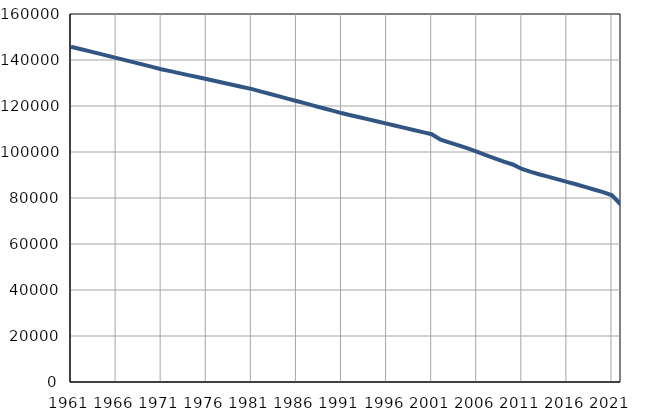
| Category | Population
size |
|---|---|
| 1961.0 | 145789 |
| 1962.0 | 144811 |
| 1963.0 | 143833 |
| 1964.0 | 142855 |
| 1965.0 | 141877 |
| 1966.0 | 140899 |
| 1967.0 | 139920 |
| 1968.0 | 138942 |
| 1969.0 | 137964 |
| 1970.0 | 136986 |
| 1971.0 | 136008 |
| 1972.0 | 135150 |
| 1973.0 | 134292 |
| 1974.0 | 133434 |
| 1975.0 | 132576 |
| 1976.0 | 131718 |
| 1977.0 | 130859 |
| 1978.0 | 130001 |
| 1979.0 | 129143 |
| 1980.0 | 128285 |
| 1981.0 | 127427 |
| 1982.0 | 126377 |
| 1983.0 | 125327 |
| 1984.0 | 124277 |
| 1985.0 | 123227 |
| 1986.0 | 122177 |
| 1987.0 | 121126 |
| 1988.0 | 120076 |
| 1989.0 | 119026 |
| 1990.0 | 117976 |
| 1991.0 | 116926 |
| 1992.0 | 116007 |
| 1993.0 | 115088 |
| 1994.0 | 114168 |
| 1995.0 | 113249 |
| 1996.0 | 112330 |
| 1997.0 | 111411 |
| 1998.0 | 110492 |
| 1999.0 | 109573 |
| 2000.0 | 108653 |
| 2001.0 | 107734 |
| 2002.0 | 105314 |
| 2003.0 | 104072 |
| 2004.0 | 102868 |
| 2005.0 | 101538 |
| 2006.0 | 100133 |
| 2007.0 | 98681 |
| 2008.0 | 97223 |
| 2009.0 | 95861 |
| 2010.0 | 94575 |
| 2011.0 | 92614 |
| 2012.0 | 91358 |
| 2013.0 | 90216 |
| 2014.0 | 89191 |
| 2015.0 | 88095 |
| 2016.0 | 87015 |
| 2017.0 | 85964 |
| 2018.0 | 84827 |
| 2019.0 | 83699 |
| 2020.0 | 82537 |
| 2021.0 | 81165 |
| 2022.0 | 77039 |